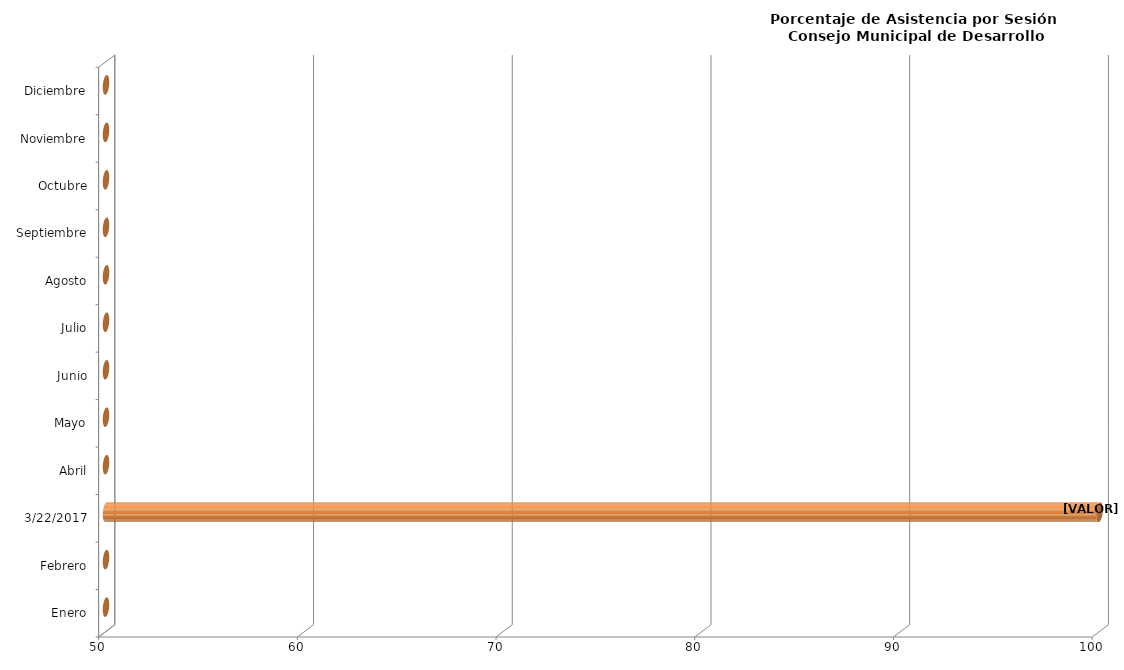
| Category | Series 0 |
|---|---|
| Enero | 0 |
| Febrero | 0 |
| 22/03/2017 | 100 |
| Abril | 0 |
| Mayo | 0 |
| Junio | 0 |
| Julio | 0 |
| Agosto | 0 |
| Septiembre | 0 |
| Octubre | 0 |
| Noviembre | 0 |
| Diciembre | 0 |